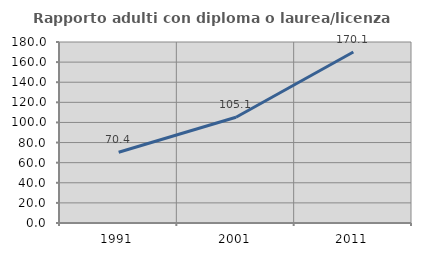
| Category | Rapporto adulti con diploma o laurea/licenza media  |
|---|---|
| 1991.0 | 70.414 |
| 2001.0 | 105.142 |
| 2011.0 | 170.105 |